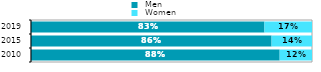
| Category |  Men |  Women |
|---|---|---|
| 2010.0 | 0.885 | 0.115 |
| 2015.0 | 0.856 | 0.144 |
| 2019.0 | 0.831 | 0.169 |